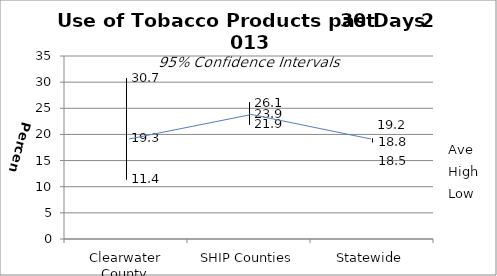
| Category | Ave | High | Low |
|---|---|---|---|
| Clearwater County | 19.3 | 30.7 | 11.4 |
| SHIP Counties | 23.9 | 26.1 | 21.9 |
| Statewide | 18.8 | 19.2 | 18.5 |